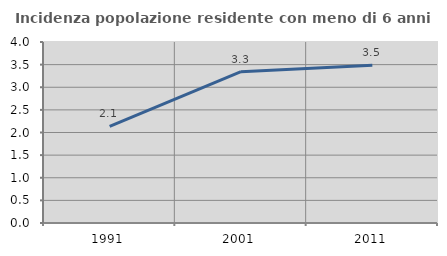
| Category | Incidenza popolazione residente con meno di 6 anni |
|---|---|
| 1991.0 | 2.134 |
| 2001.0 | 3.343 |
| 2011.0 | 3.488 |